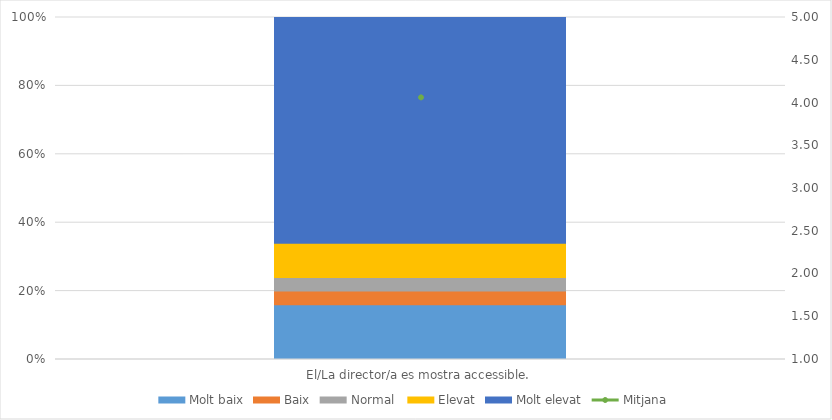
| Category | Molt baix | Baix | Normal  | Elevat | Molt elevat |
|---|---|---|---|---|---|
| El/La director/a es mostra accessible. | 8 | 2 | 2 | 5 | 33 |